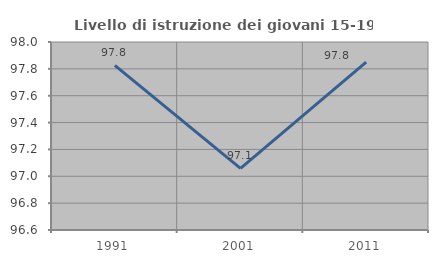
| Category | Livello di istruzione dei giovani 15-19 anni |
|---|---|
| 1991.0 | 97.826 |
| 2001.0 | 97.059 |
| 2011.0 | 97.849 |